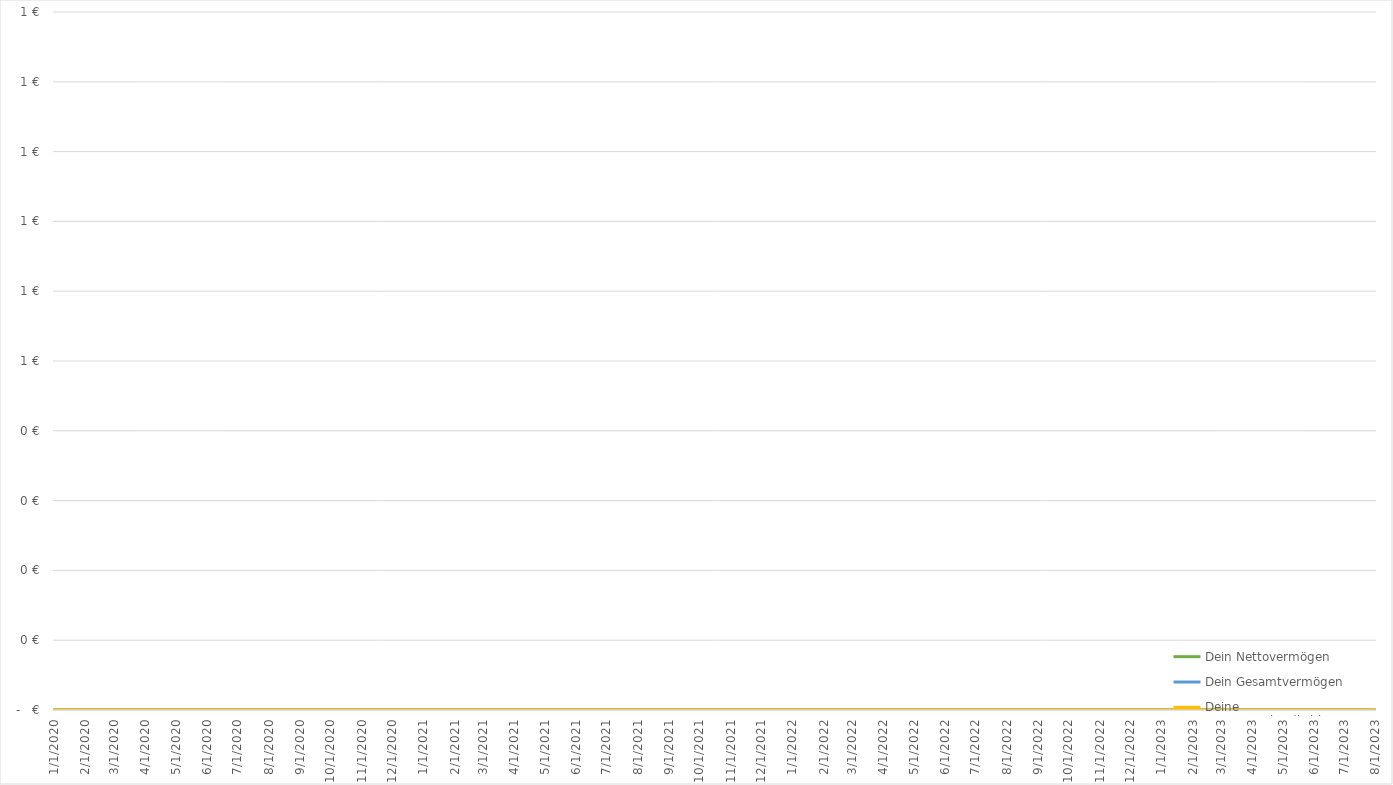
| Category | Dein Nettovermögen | Dein Gesamtvermögen | Deine Gesamtverbindlichkeiten |
|---|---|---|---|
| 1/1/20 | 0 | 0 | 0 |
| 2/1/20 | 0 | 0 | 0 |
| 3/1/20 | 0 | 0 | 0 |
| 4/1/20 | 0 | 0 | 0 |
| 5/1/20 | 0 | 0 | 0 |
| 6/1/20 | 0 | 0 | 0 |
| 7/1/20 | 0 | 0 | 0 |
| 8/1/20 | 0 | 0 | 0 |
| 9/1/20 | 0 | 0 | 0 |
| 10/1/20 | 0 | 0 | 0 |
| 11/1/20 | 0 | 0 | 0 |
| 12/1/20 | 0 | 0 | 0 |
| 1/1/21 | 0 | 0 | 0 |
| 2/1/21 | 0 | 0 | 0 |
| 3/1/21 | 0 | 0 | 0 |
| 4/1/21 | 0 | 0 | 0 |
| 5/1/21 | 0 | 0 | 0 |
| 6/1/21 | 0 | 0 | 0 |
| 7/1/21 | 0 | 0 | 0 |
| 8/1/21 | 0 | 0 | 0 |
| 9/1/21 | 0 | 0 | 0 |
| 10/1/21 | 0 | 0 | 0 |
| 11/1/21 | 0 | 0 | 0 |
| 12/1/21 | 0 | 0 | 0 |
| 1/1/22 | 0 | 0 | 0 |
| 2/1/22 | 0 | 0 | 0 |
| 3/1/22 | 0 | 0 | 0 |
| 4/1/22 | 0 | 0 | 0 |
| 5/1/22 | 0 | 0 | 0 |
| 6/1/22 | 0 | 0 | 0 |
| 7/1/22 | 0 | 0 | 0 |
| 8/1/22 | 0 | 0 | 0 |
| 9/1/22 | 0 | 0 | 0 |
| 10/1/22 | 0 | 0 | 0 |
| 11/1/22 | 0 | 0 | 0 |
| 12/1/22 | 0 | 0 | 0 |
| 1/1/23 | 0 | 0 | 0 |
| 2/1/23 | 0 | 0 | 0 |
| 3/1/23 | 0 | 0 | 0 |
| 4/1/23 | 0 | 0 | 0 |
| 5/1/23 | 0 | 0 | 0 |
| 6/1/23 | 0 | 0 | 0 |
| 7/1/23 | 0 | 0 | 0 |
| 8/1/23 | 0 | 0 | 0 |